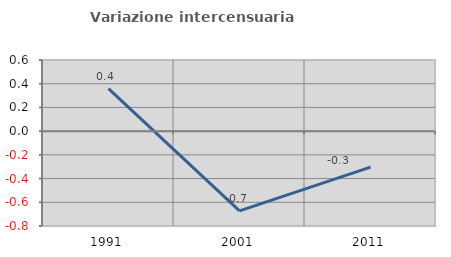
| Category | Variazione intercensuaria annua |
|---|---|
| 1991.0 | 0.359 |
| 2001.0 | -0.673 |
| 2011.0 | -0.303 |